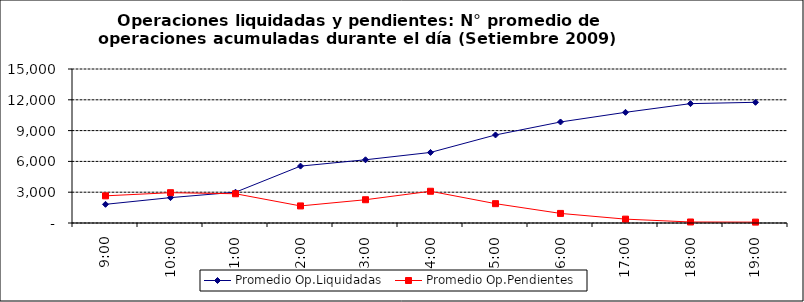
| Category | Promedio Op.Liquidadas | Promedio Op.Pendientes |
|---|---|---|
| 0.375 | 1819.476 | 2646.524 |
| 0.4166666666666667 | 2472.143 | 2951.429 |
| 0.4583333333333333 | 2999.143 | 2849.286 |
| 0.5 | 5541.762 | 1663.048 |
| 0.5416666666666666 | 6158.952 | 2266.619 |
| 0.5833333333333334 | 6873.476 | 3091.286 |
| 0.625 | 8575.81 | 1882.667 |
| 0.6666666666666666 | 9840.619 | 933.762 |
| 0.7083333333333334 | 10780.429 | 376.762 |
| 0.75 | 11627.286 | 98.19 |
| 0.7916666666666666 | 11755.667 | 85.619 |